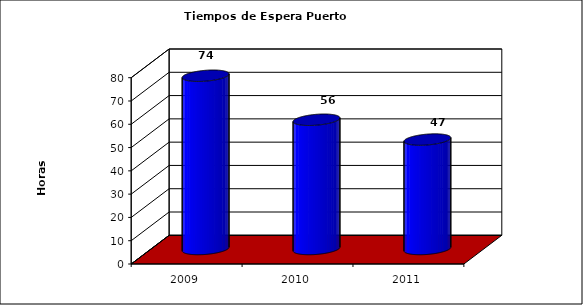
| Category | Series 0 |
|---|---|
| 2009.0 | 74.4 |
| 2010.0 | 55.5 |
| 2011.0 | 47 |